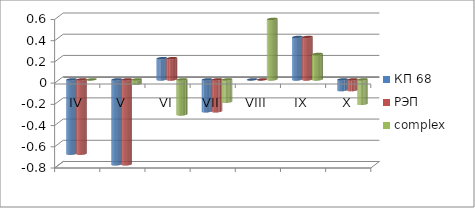
| Category | КП 68 | РЭП  | complex |
|---|---|---|---|
| IV | -0.7 | -0.7 | 0 |
| V | -0.8 | -0.8 | -0.04 |
| VI | 0.2 | 0.2 | -0.33 |
| VII | -0.3 | -0.3 | -0.21 |
| VIII | 0 | 0 | 0.57 |
| IX | 0.4 | 0.4 | 0.24 |
| X | -0.1 | -0.1 | -0.23 |